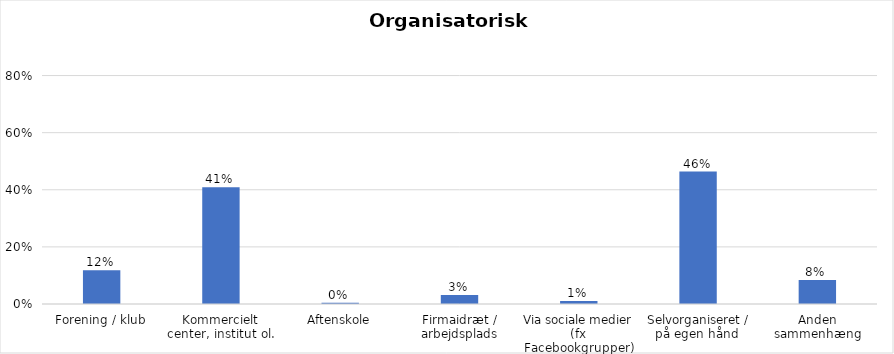
| Category | % |
|---|---|
| Forening / klub | 0.118 |
| Kommercielt center, institut ol. | 0.409 |
| Aftenskole | 0.004 |
| Firmaidræt / arbejdsplads | 0.031 |
| Via sociale medier (fx Facebookgrupper) | 0.011 |
| Selvorganiseret / på egen hånd  | 0.464 |
| Anden sammenhæng | 0.084 |